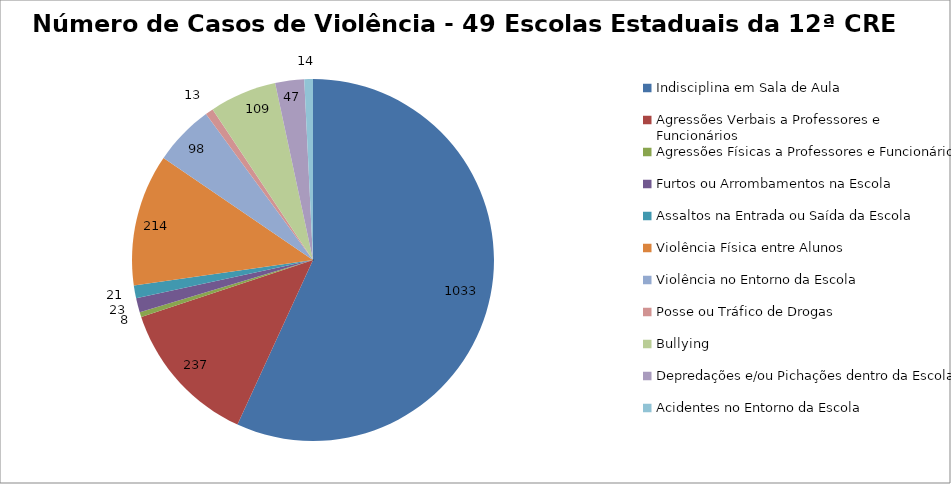
| Category | Número de Casos |
|---|---|
| Indisciplina em Sala de Aula | 1033 |
| Agressões Verbais a Professores e Funcionários | 237 |
| Agressões Físicas a Professores e Funcionários | 8 |
| Furtos ou Arrombamentos na Escola | 23 |
| Assaltos na Entrada ou Saída da Escola | 21 |
| Violência Física entre Alunos | 214 |
| Violência no Entorno da Escola | 98 |
| Posse ou Tráfico de Drogas | 13 |
| Bullying | 109 |
| Depredações e/ou Pichações dentro da Escola | 47 |
| Acidentes no Entorno da Escola | 14 |